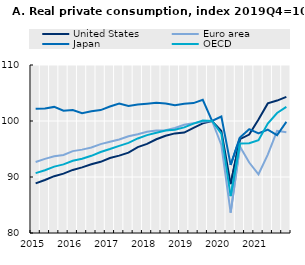
| Category | United States | Euro area | Japan | OECD |
|---|---|---|---|---|
| 2015 | 88.859 | 92.689 | 102.18 | 90.688 |
|  | 89.461 | 93.239 | 102.244 | 91.196 |
|  | 90.143 | 93.717 | 102.517 | 91.85 |
|  | 90.597 | 93.937 | 101.846 | 92.251 |
| 2016 | 91.261 | 94.623 | 101.973 | 92.902 |
|  | 91.725 | 94.888 | 101.378 | 93.27 |
|  | 92.262 | 95.26 | 101.742 | 93.785 |
|  | 92.71 | 95.871 | 101.95 | 94.468 |
| 2017 | 93.383 | 96.281 | 102.593 | 94.993 |
|  | 93.819 | 96.686 | 103.111 | 95.56 |
|  | 94.35 | 97.278 | 102.689 | 96.102 |
|  | 95.343 | 97.636 | 102.934 | 96.883 |
| 2018 | 95.914 | 98.088 | 103.092 | 97.478 |
|  | 96.735 | 98.294 | 103.252 | 97.908 |
|  | 97.37 | 98.369 | 103.139 | 98.318 |
|  | 97.785 | 98.753 | 102.806 | 98.438 |
| 2019 | 97.933 | 99.335 | 103.076 | 98.856 |
|  | 98.791 | 99.611 | 103.193 | 99.531 |
|  | 99.572 | 99.877 | 103.789 | 100.097 |
|  | 100 | 100 | 100 | 100 |
| 2020 | 98.23 | 95.715 | 100.805 | 97.757 |
|  | 88.734 | 83.628 | 92.154 | 86.584 |
|  | 96.768 | 95.431 | 97.05 | 95.968 |
|  | 97.577 | 92.582 | 98.535 | 96.021 |
| 2021 | 100.254 | 90.485 | 97.797 | 96.581 |